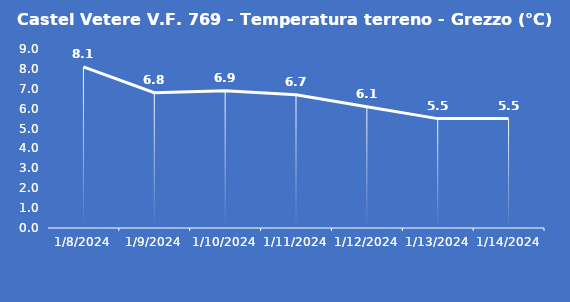
| Category | Castel Vetere V.F. 769 - Temperatura terreno - Grezzo (°C) |
|---|---|
| 1/8/24 | 8.1 |
| 1/9/24 | 6.8 |
| 1/10/24 | 6.9 |
| 1/11/24 | 6.7 |
| 1/12/24 | 6.1 |
| 1/13/24 | 5.5 |
| 1/14/24 | 5.5 |